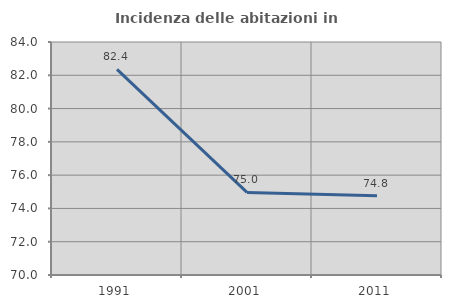
| Category | Incidenza delle abitazioni in proprietà  |
|---|---|
| 1991.0 | 82.353 |
| 2001.0 | 74.964 |
| 2011.0 | 74.763 |